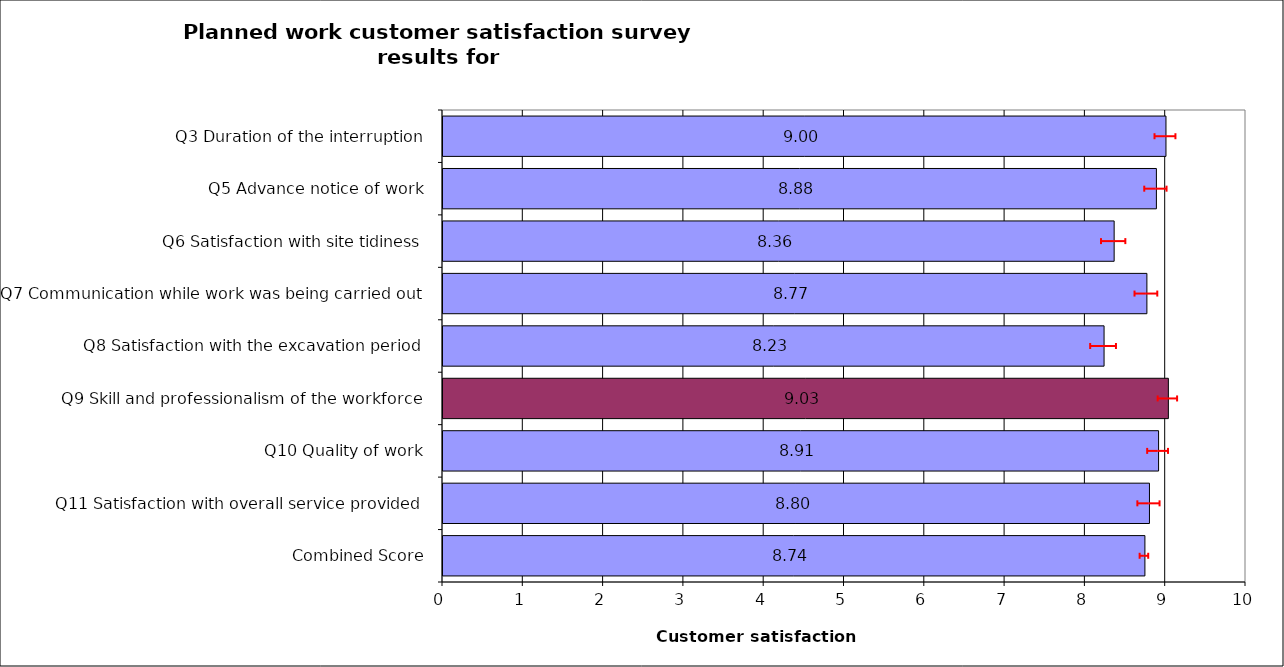
| Category | Series 0 |
|---|---|
| Q3 Duration of the interruption | 9.003 |
| Q5 Advance notice of work | 8.884 |
| Q6 Satisfaction with site tidiness | 8.358 |
| Q7 Communication while work was being carried out | 8.766 |
| Q8 Satisfaction with the excavation period | 8.232 |
| Q9 Skill and professionalism of the workforce | 9.033 |
| Q10 Quality of work | 8.911 |
| Q11 Satisfaction with overall service provided | 8.798 |
| Combined Score | 8.741 |